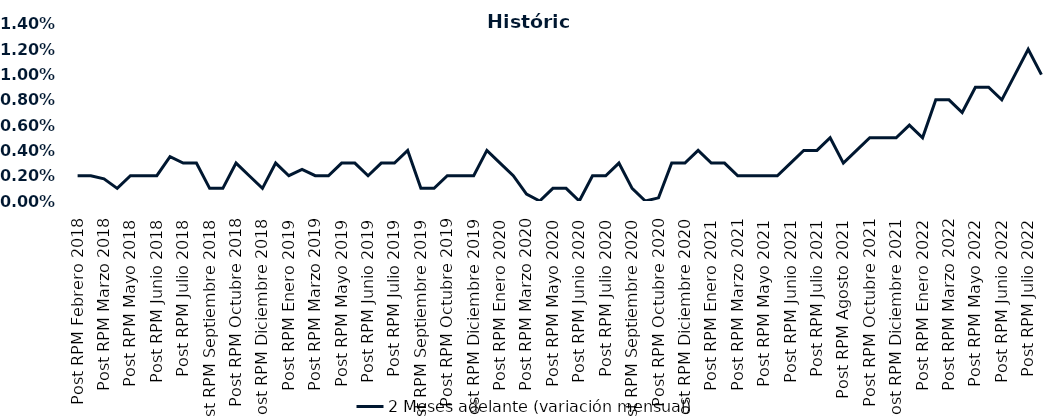
| Category | 2 Meses adelante (variación mensual) |
|---|---|
| Post RPM Febrero 2018 | 0.002 |
| Pre RPM Marzo 2018 | 0.002 |
| Post RPM Marzo 2018 | 0.002 |
| Pre RPM Mayo 2018 | 0.001 |
| Post RPM Mayo 2018 | 0.002 |
| Pre RPM Junio 2018 | 0.002 |
| Post RPM Junio 2018 | 0.002 |
| Pre RPM Julio 2018 | 0.004 |
| Post RPM Julio 2018 | 0.003 |
| Pre RPM Septiembre 2018 | 0.003 |
| Post RPM Septiembre 2018 | 0.001 |
| Pre RPM Octubre 2018 | 0.001 |
| Post RPM Octubre 2018 | 0.003 |
| Pre RPM Diciembre 2018 | 0.002 |
| Post RPM Diciembre 2018 | 0.001 |
| Pre RPM Enero 2019 | 0.003 |
| Post RPM Enero 2019 | 0.002 |
| Pre RPM Marzo 2019 | 0.002 |
| Post RPM Marzo 2019 | 0.002 |
| Pre RPM Mayo 2019 | 0.002 |
| Post RPM Mayo 2019 | 0.003 |
| Pre RPM Junio 2019 | 0.003 |
| Post RPM Junio 2019 | 0.002 |
| Pre RPM Julio 2019 | 0.003 |
| Post RPM Julio 2019 | 0.003 |
| Pre RPM Septiembre 2019 | 0.004 |
| Post RPM Septiembre 2019 | 0.001 |
| Pre RPM Octubre 2019 | 0.001 |
| Post RPM Octubre 2019 | 0.002 |
| Pre RPM Diciembre 2019 | 0.002 |
| Post RPM Diciembre 2019 | 0.002 |
| Pre RPM Enero 2020 | 0.004 |
| Post RPM Enero 2020 | 0.003 |
| Pre RPM Marzo 2020 | 0.002 |
| Post RPM Marzo 2020 | 0.001 |
| Pre RPM Mayo 2020 | 0 |
| Post RPM Mayo 2020 | 0.001 |
| Pre RPM Junio 2020 | 0.001 |
| Post RPM Junio 2020 | 0 |
| Pre RPM Julio 2020 | 0.002 |
| Post RPM Julio 2020 | 0.002 |
| Pre RPM Septiembre 2020 | 0.003 |
| Post RPM Septiembre 2020 | 0.001 |
| Pre RPM Octubre 2020 | 0 |
| Post RPM Octubre 2020 | 0 |
| Pre RPM Diciembre 2020 | 0.003 |
| Post RPM Diciembre 2020 | 0.003 |
| Pre RPM Enero 2021 | 0.004 |
| Post RPM Enero 2021 | 0.003 |
| Pre RPM Marzo 2021 | 0.003 |
| Post RPM Marzo 2021 | 0.002 |
| Pre RPM Mayo 2021 | 0.002 |
| Post RPM Mayo 2021 | 0.002 |
| Pre RPM Junio 2021 | 0.002 |
| Post RPM Junio 2021 | 0.003 |
| Pre RPM Julio 2021 | 0.004 |
| Post RPM Julio 2021 | 0.004 |
| Pre RPM Agosto 2021 | 0.005 |
| Post RPM Agosto 2021 | 0.003 |
| Pre RPM Octubre 2021 | 0.004 |
| Post RPM Octubre 2021 | 0.005 |
| Pre RPM Diciembre 2021 | 0.005 |
| Post RPM Diciembre 2021 | 0.005 |
| Pre RPM Enero 2022 | 0.006 |
| Post RPM Enero 2022 | 0.005 |
| Pre RPM Marzo 2022 | 0.008 |
| Post RPM Marzo 2022 | 0.008 |
| Pre RPM Mayo 2022 | 0.007 |
| Post RPM Mayo 2022 | 0.009 |
| Pre RPM Junio 2022 | 0.009 |
| Post RPM Junio 2022 | 0.008 |
| Pre RPM Julio 2022 | 0.01 |
| Post RPM Julio 2022 | 0.012 |
| Pre RPM Septiembre 2022 | 0.01 |